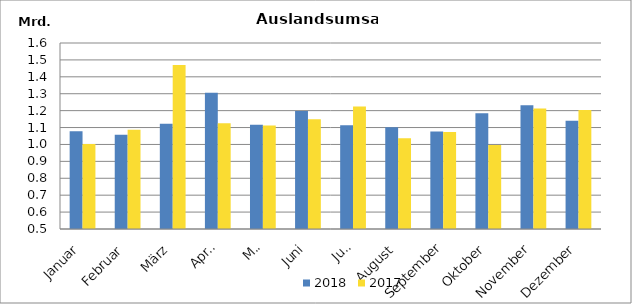
| Category | 2018 | 2017 |
|---|---|---|
| Januar | 1078719.983 | 1002171.148 |
| Februar | 1057828.381 | 1086637.203 |
| März | 1123108.925 | 1469985.048 |
| April | 1305453.106 | 1125087.198 |
| Mai | 1116932.705 | 1112588.876 |
| Juni | 1197507.355 | 1149436.675 |
| Juli | 1113130.45 | 1224195.851 |
| August | 1102014.094 | 1037193.099 |
| September | 1077119.843 | 1073001.642 |
| Oktober | 1183945.033 | 997443.947 |
| November | 1231538.282 | 1213243.991 |
| Dezember | 1140285.307 | 1203870.924 |